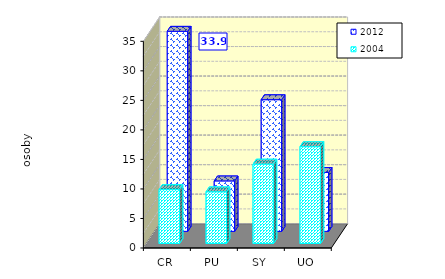
| Category | 2012 | 2004 |
|---|---|---|
| CR | 33.883 | 9.132 |
| PU | 8.545 | 8.76 |
| SY | 22.297 | 13.451 |
| UO | 9.975 | 16.402 |